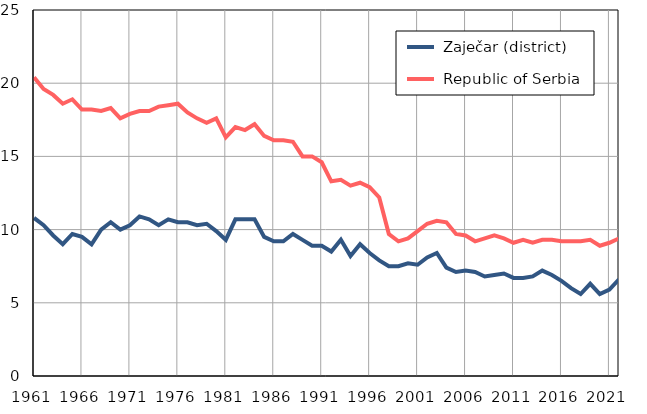
| Category |  Zaječar (district) |  Republic of Serbia |
|---|---|---|
| 1961.0 | 10.8 | 20.4 |
| 1962.0 | 10.3 | 19.6 |
| 1963.0 | 9.6 | 19.2 |
| 1964.0 | 9 | 18.6 |
| 1965.0 | 9.7 | 18.9 |
| 1966.0 | 9.5 | 18.2 |
| 1967.0 | 9 | 18.2 |
| 1968.0 | 10 | 18.1 |
| 1969.0 | 10.5 | 18.3 |
| 1970.0 | 10 | 17.6 |
| 1971.0 | 10.3 | 17.9 |
| 1972.0 | 10.9 | 18.1 |
| 1973.0 | 10.7 | 18.1 |
| 1974.0 | 10.3 | 18.4 |
| 1975.0 | 10.7 | 18.5 |
| 1976.0 | 10.5 | 18.6 |
| 1977.0 | 10.5 | 18 |
| 1978.0 | 10.3 | 17.6 |
| 1979.0 | 10.4 | 17.3 |
| 1980.0 | 9.9 | 17.6 |
| 1981.0 | 9.3 | 16.3 |
| 1982.0 | 10.7 | 17 |
| 1983.0 | 10.7 | 16.8 |
| 1984.0 | 10.7 | 17.2 |
| 1985.0 | 9.5 | 16.4 |
| 1986.0 | 9.2 | 16.1 |
| 1987.0 | 9.2 | 16.1 |
| 1988.0 | 9.7 | 16 |
| 1989.0 | 9.3 | 15 |
| 1990.0 | 8.9 | 15 |
| 1991.0 | 8.9 | 14.6 |
| 1992.0 | 8.5 | 13.3 |
| 1993.0 | 9.3 | 13.4 |
| 1994.0 | 8.2 | 13 |
| 1995.0 | 9 | 13.2 |
| 1996.0 | 8.4 | 12.9 |
| 1997.0 | 7.9 | 12.2 |
| 1998.0 | 7.5 | 9.7 |
| 1999.0 | 7.5 | 9.2 |
| 2000.0 | 7.7 | 9.4 |
| 2001.0 | 7.6 | 9.9 |
| 2002.0 | 8.1 | 10.4 |
| 2003.0 | 8.4 | 10.6 |
| 2004.0 | 7.4 | 10.5 |
| 2005.0 | 7.1 | 9.7 |
| 2006.0 | 7.2 | 9.6 |
| 2007.0 | 7.1 | 9.2 |
| 2008.0 | 6.8 | 9.4 |
| 2009.0 | 6.9 | 9.6 |
| 2010.0 | 7 | 9.4 |
| 2011.0 | 6.7 | 9.1 |
| 2012.0 | 6.7 | 9.3 |
| 2013.0 | 6.8 | 9.1 |
| 2014.0 | 7.2 | 9.3 |
| 2015.0 | 6.9 | 9.3 |
| 2016.0 | 6.5 | 9.2 |
| 2017.0 | 6 | 9.2 |
| 2018.0 | 5.6 | 9.2 |
| 2019.0 | 6.3 | 9.3 |
| 2020.0 | 5.6 | 8.9 |
| 2021.0 | 5.9 | 9.1 |
| 2022.0 | 6.6 | 9.4 |